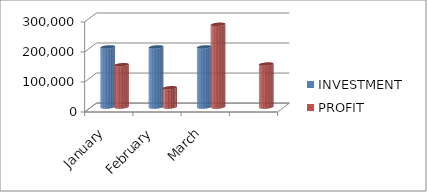
| Category | INVESTMENT  | PROFIT |
|---|---|---|
| January | 200000 | 140643 |
| February | 200000 | 63900 |
| March | 200000 | 275350 |